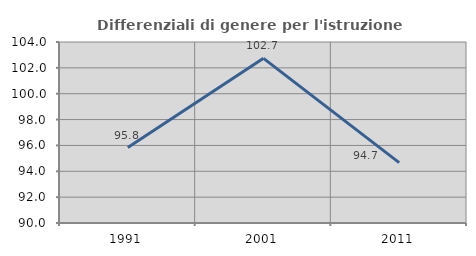
| Category | Differenziali di genere per l'istruzione superiore |
|---|---|
| 1991.0 | 95.834 |
| 2001.0 | 102.736 |
| 2011.0 | 94.672 |